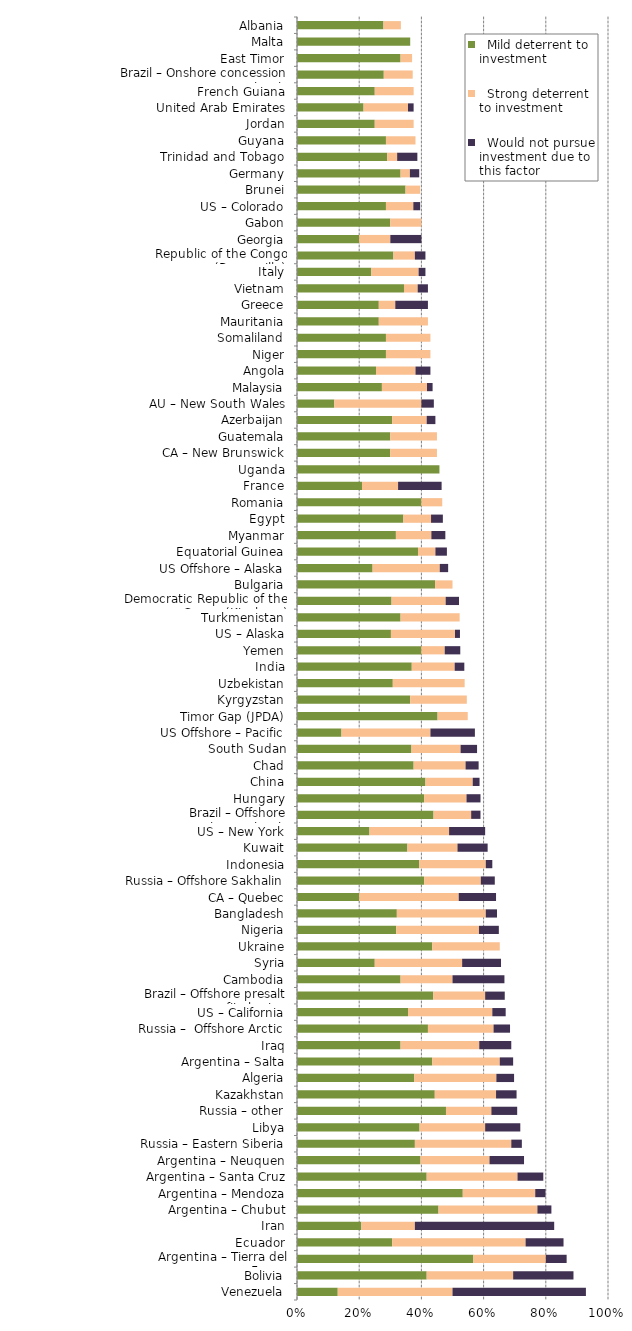
| Category |   Mild deterrent to investment |   Strong deterrent to investment |   Would not pursue investment due to this factor |
|---|---|---|---|
| Venezuela | 0.131 | 0.369 | 0.429 |
| Bolivia | 0.417 | 0.278 | 0.194 |
| Argentina – Tierra del Fuego | 0.567 | 0.233 | 0.067 |
| Ecuador | 0.306 | 0.429 | 0.122 |
| Iran | 0.207 | 0.172 | 0.448 |
| Argentina – Chubut | 0.455 | 0.318 | 0.045 |
| Argentina – Mendoza | 0.533 | 0.233 | 0.033 |
| Argentina – Santa Cruz | 0.417 | 0.292 | 0.083 |
| Argentina – Neuquen | 0.397 | 0.222 | 0.111 |
| Russia – Eastern Siberia | 0.379 | 0.31 | 0.034 |
| Libya | 0.394 | 0.211 | 0.113 |
| Russia – other | 0.479 | 0.146 | 0.083 |
| Kazakhstan | 0.443 | 0.197 | 0.066 |
| Algeria | 0.377 | 0.264 | 0.057 |
| Argentina – Salta | 0.435 | 0.217 | 0.043 |
| Iraq | 0.333 | 0.253 | 0.103 |
| Russia –  Offshore Arctic | 0.421 | 0.211 | 0.053 |
| US – California | 0.357 | 0.271 | 0.043 |
| Brazil – Offshore presalt area profit sharing contracts | 0.438 | 0.167 | 0.063 |
| Cambodia | 0.333 | 0.167 | 0.167 |
| Syria | 0.25 | 0.281 | 0.125 |
| Ukraine | 0.435 | 0.217 | 0 |
| Nigeria | 0.319 | 0.266 | 0.064 |
| Bangladesh | 0.321 | 0.286 | 0.036 |
| CA – Quebec | 0.2 | 0.32 | 0.12 |
| Russia – Offshore Sakhalin | 0.409 | 0.182 | 0.045 |
| Indonesia | 0.393 | 0.214 | 0.021 |
| Kuwait | 0.355 | 0.161 | 0.097 |
| US – New York | 0.233 | 0.256 | 0.116 |
| Brazil – Offshore concession contracts | 0.439 | 0.121 | 0.03 |
| Hungary | 0.409 | 0.136 | 0.045 |
| China | 0.413 | 0.152 | 0.022 |
| Chad | 0.375 | 0.167 | 0.042 |
| South Sudan | 0.368 | 0.158 | 0.053 |
| US Offshore – Pacific | 0.143 | 0.286 | 0.143 |
| Timor Gap (JPDA) | 0.452 | 0.097 | 0 |
| Kyrgyzstan | 0.364 | 0.182 | 0 |
| Uzbekistan | 0.308 | 0.231 | 0 |
| India | 0.369 | 0.138 | 0.031 |
| Yemen | 0.4 | 0.075 | 0.05 |
| US – Alaska | 0.302 | 0.206 | 0.016 |
| Turkmenistan | 0.333 | 0.19 | 0 |
| Democratic Republic of the Congo (Kinshasa) | 0.304 | 0.174 | 0.043 |
| Bulgaria | 0.444 | 0.056 | 0 |
| US Offshore – Alaska | 0.243 | 0.216 | 0.027 |
| Equatorial Guinea | 0.389 | 0.056 | 0.037 |
| Myanmar | 0.318 | 0.114 | 0.045 |
| Egypt | 0.342 | 0.089 | 0.038 |
| Romania | 0.4 | 0.067 | 0 |
| France | 0.209 | 0.116 | 0.14 |
| Uganda | 0.458 | 0 | 0 |
| CA – New Brunswick | 0.3 | 0.15 | 0 |
| Guatemala | 0.3 | 0.15 | 0 |
| Azerbaijan | 0.306 | 0.111 | 0.028 |
| AU – New South Wales | 0.12 | 0.28 | 0.04 |
| Malaysia | 0.273 | 0.145 | 0.018 |
| Angola | 0.254 | 0.127 | 0.048 |
| Niger | 0.286 | 0.143 | 0 |
| Somaliland | 0.286 | 0.143 | 0 |
| Mauritania | 0.263 | 0.158 | 0 |
| Greece | 0.263 | 0.053 | 0.105 |
| Vietnam | 0.344 | 0.044 | 0.033 |
| Italy | 0.239 | 0.152 | 0.022 |
| Republic of the Congo (Brazzaville) | 0.31 | 0.069 | 0.034 |
| Georgia | 0.2 | 0.1 | 0.1 |
| Gabon | 0.3 | 0.1 | 0 |
| US – Colorado | 0.286 | 0.088 | 0.022 |
| Brunei | 0.349 | 0.047 | 0 |
| Germany | 0.333 | 0.03 | 0.03 |
| Trinidad and Tobago | 0.29 | 0.032 | 0.065 |
| Guyana | 0.286 | 0.095 | 0 |
| Jordan | 0.25 | 0.125 | 0 |
| United Arab Emirates | 0.214 | 0.143 | 0.018 |
| French Guiana | 0.25 | 0.125 | 0 |
| Brazil – Onshore concession contracts | 0.279 | 0.093 | 0 |
| East Timor | 0.333 | 0.037 | 0 |
| Malta | 0.364 | 0 | 0 |
| Albania | 0.278 | 0.056 | 0 |